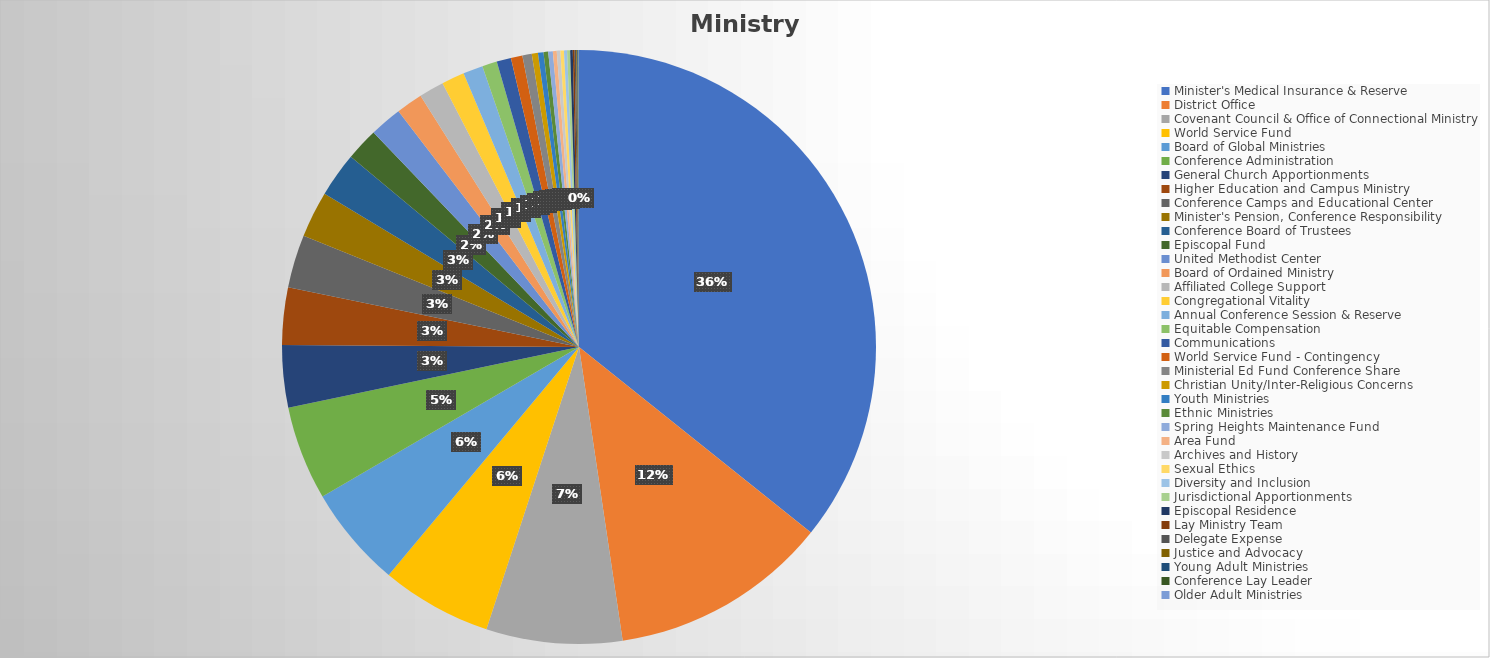
| Category | Ministry Support |
|---|---|
| Minister's Medical Insurance & Reserve | 4258360 |
| District Office  | 1419264 |
| Covenant Council & Office of Connectional Ministry | 881400 |
| World Service Fund | 717399 |
| Board of Global Ministries | 658760 |
| Conference Administration | 610211 |
| General Church Apportionments | 404147 |
| Higher Education and Campus Ministry | 371374 |
| Conference Camps and Educational Center | 343016 |
| Minister's Pension, Conference Responsibility | 300000 |
| Conference Board of Trustees | 290000 |
| Episcopal Fund | 212451 |
| United Methodist Center | 209900 |
| Board of Ordained Ministry | 171800 |
| Affiliated College Support | 162000 |
| Congregational Vitality | 148200 |
| Annual Conference Session & Reserve | 128800 |
| Equitable Compensation | 96000 |
| Communications | 93250 |
| World Service Fund - Contingency | 75000 |
| Ministerial Ed Fund Conference Share | 60576 |
| Christian Unity/Inter-Religious Concerns | 40000 |
| Youth Ministries | 35800 |
| Ethnic Ministries | 30060 |
| Spring Heights Maintenance Fund | 30000 |
| Area Fund | 25000 |
| Archives and History | 23300 |
| Sexual Ethics | 23000 |
| Diversity and Inclusion | 20000 |
| Jurisdictional Apportionments | 19398 |
| Episcopal Residence | 17000 |
| Lay Ministry Team | 11900 |
| Delegate Expense | 10000 |
| Justice and Advocacy | 6755 |
| Young Adult Ministries | 5500 |
| Conference Lay Leader | 3300 |
| Older Adult Ministries | 2300 |